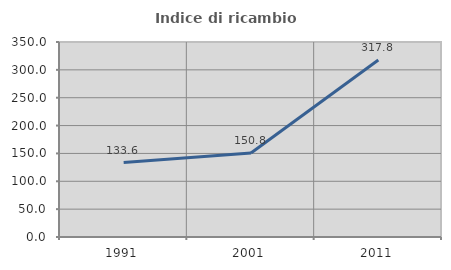
| Category | Indice di ricambio occupazionale  |
|---|---|
| 1991.0 | 133.596 |
| 2001.0 | 150.798 |
| 2011.0 | 317.844 |